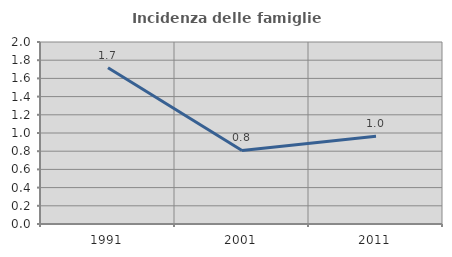
| Category | Incidenza delle famiglie numerose |
|---|---|
| 1991.0 | 1.716 |
| 2001.0 | 0.808 |
| 2011.0 | 0.965 |